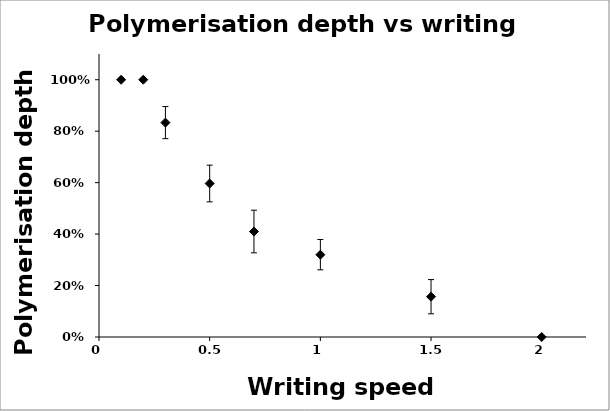
| Category | Series 0 |
|---|---|
| 0.1 | 1 |
| 0.2 | 1 |
| 0.3 | 0.833 |
| 0.5 | 0.597 |
| 0.7 | 0.41 |
| 1.0 | 0.32 |
| 1.5 | 0.157 |
| 2.0 | 0 |